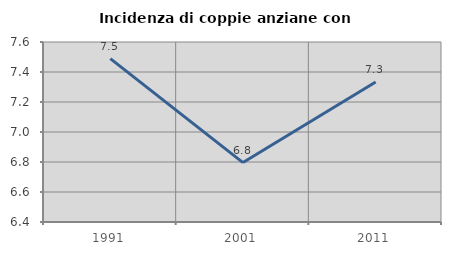
| Category | Incidenza di coppie anziane con figli |
|---|---|
| 1991.0 | 7.489 |
| 2001.0 | 6.796 |
| 2011.0 | 7.333 |